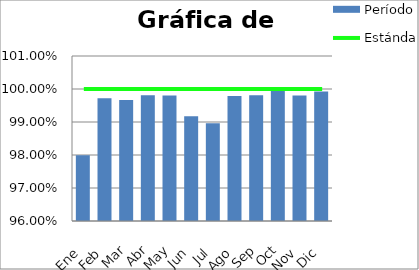
| Category | Período |
|---|---|
| Ene | 0.98 |
| Feb | 0.997 |
| Mar | 0.997 |
| Abr | 0.998 |
| May | 0.998 |
| Jun | 0.992 |
| Jul | 0.99 |
| Ago | 0.998 |
| Sep | 0.998 |
| Oct | 0.999 |
| Nov | 0.998 |
| Dic | 0.999 |